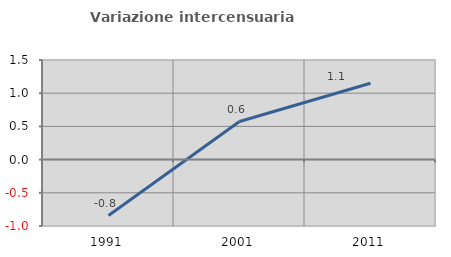
| Category | Variazione intercensuaria annua |
|---|---|
| 1991.0 | -0.842 |
| 2001.0 | 0.573 |
| 2011.0 | 1.149 |